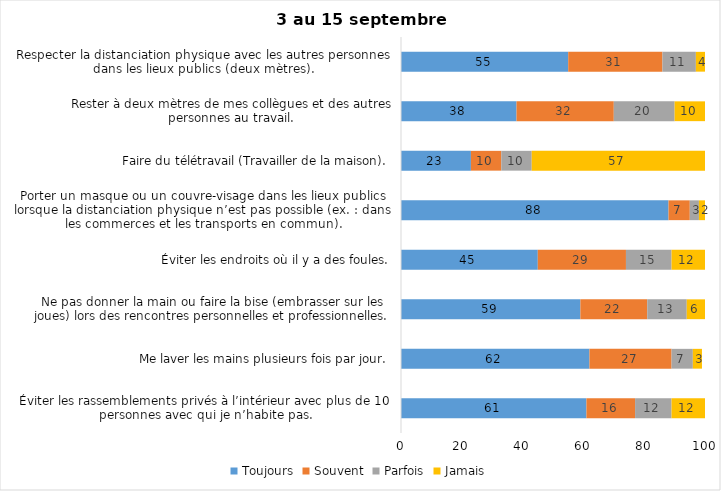
| Category | Toujours | Souvent | Parfois | Jamais |
|---|---|---|---|---|
| Éviter les rassemblements privés à l’intérieur avec plus de 10 personnes avec qui je n’habite pas. | 61 | 16 | 12 | 12 |
| Me laver les mains plusieurs fois par jour. | 62 | 27 | 7 | 3 |
| Ne pas donner la main ou faire la bise (embrasser sur les joues) lors des rencontres personnelles et professionnelles. | 59 | 22 | 13 | 6 |
| Éviter les endroits où il y a des foules. | 45 | 29 | 15 | 12 |
| Porter un masque ou un couvre-visage dans les lieux publics lorsque la distanciation physique n’est pas possible (ex. : dans les commerces et les transports en commun). | 88 | 7 | 3 | 2 |
| Faire du télétravail (Travailler de la maison). | 23 | 10 | 10 | 57 |
| Rester à deux mètres de mes collègues et des autres personnes au travail. | 38 | 32 | 20 | 10 |
| Respecter la distanciation physique avec les autres personnes dans les lieux publics (deux mètres). | 55 | 31 | 11 | 4 |